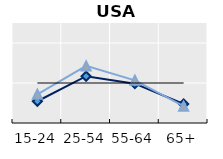
| Category | Foreign-born | Native-born | Series 1 |
|---|---|---|---|
| 15-24 | 0.544 | 0.717 | 1 |
| 25-54 | 1.169 | 1.427 | 1 |
| 55-64 | 0.983 | 1.067 | 1 |
| 65+ | 0.475 | 0.42 | 1 |